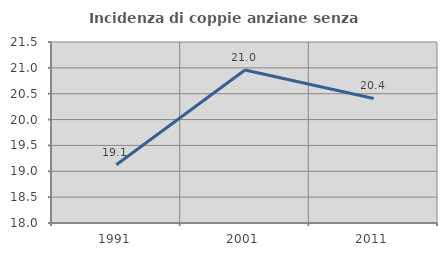
| Category | Incidenza di coppie anziane senza figli  |
|---|---|
| 1991.0 | 19.126 |
| 2001.0 | 20.958 |
| 2011.0 | 20.408 |